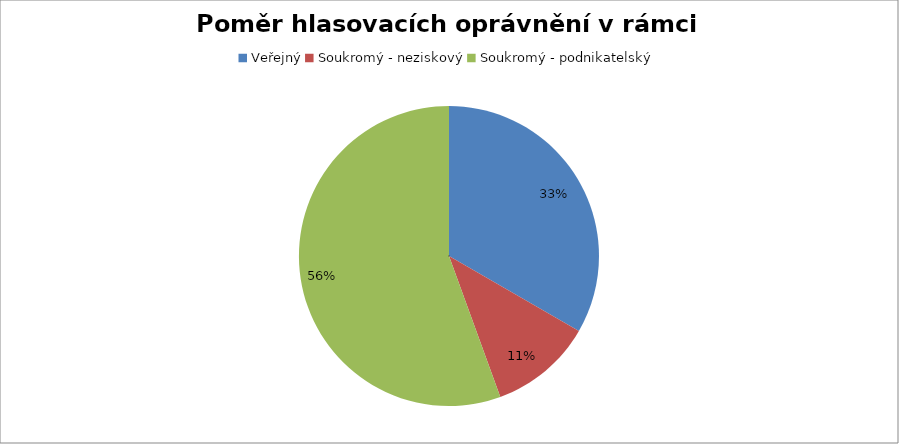
| Category | Series 0 |
|---|---|
| Veřejný | 0.333 |
| Soukromý - neziskový | 0.111 |
| Soukromý - podnikatelský | 0.556 |